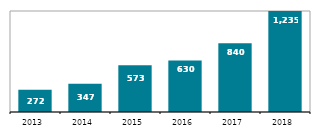
| Category |  na SIM karty využívající datové služby (bez fixního LTE) |
|---|---|
| 2013.0 | 272 |
| 2014.0 | 347 |
| 2015.0 | 573 |
| 2016.0 | 630 |
| 2017.0 | 840 |
| 2018.0 | 1235 |